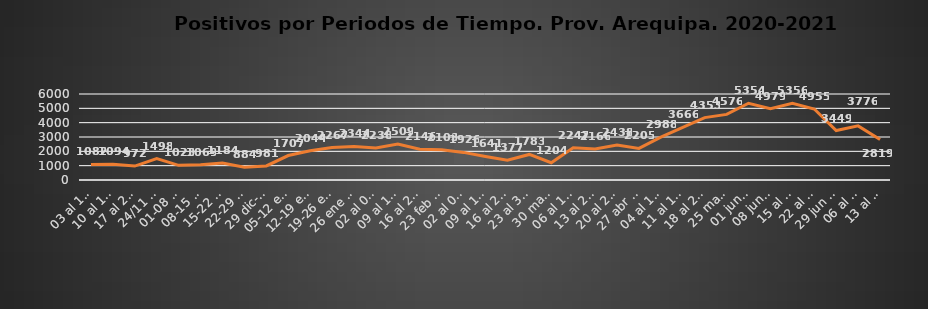
| Category | Prov. Arequipa  |
|---|---|
| 03 al 10/11 | 1082 |
| 10 al 17/11/ | 1094 |
|  17 al 24/11/ | 972 |
|  24/11 al 01/12/ | 1498 |
| 01-08 dic. | 1023 |
| 08-15 dic. | 1069 |
| 15-22 dic | 1184 |
| 22-29 dic | 884 |
| 29 dic-05/ene | 981 |
| 05-12 ene | 1707 |
| 12-19 ene | 2044 |
| 19-26 ene | 2267 |
| 26 ene -02 feb | 2344 |
| 02 al 09 feb | 2238 |
| 09 al 16 feb | 2509 |
| 16 al 23 feb | 2146 |
| 23 feb al 02 mar | 2103 |
|  02 al 09 mar | 1926 |
|  09 al 16 mar | 1641 |
|  16 al 23 mar | 1377 |
|  23 al 30 mar | 1783 |
|  30 mar al 06 abr | 1204 |
| 06 al 13 abr | 2247 |
| 13 al 20 abr | 2166 |
| 20 al 27 abr | 2438 |
| 27 abr al 04 may | 2205 |
|  04 al 11 may | 2988 |
|  11 al 18 may | 3666 |
|  18 al 25 may | 4353 |
|   25 may al 01 jun | 4576 |
|   01 jun al 08 jun | 5354 |
|   08 jun al 15 jun | 4979 |
|   15 al 22 jun  | 5356 |
|   22 al 29 jun  | 4955 |
|  29 jun al 06 jul  | 3449 |
|   06 al 13 jul  | 3776 |
|   13 al 20 jul  | 2819 |